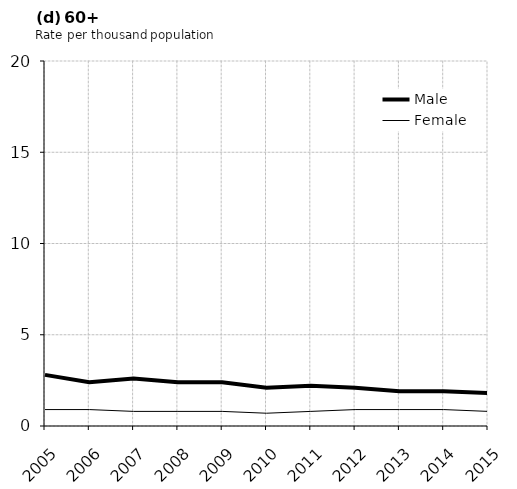
| Category | Male | Female |
|---|---|---|
| 2005.0 | 2.8 | 0.9 |
| 2006.0 | 2.4 | 0.9 |
| 2007.0 | 2.6 | 0.8 |
| 2008.0 | 2.4 | 0.8 |
| 2009.0 | 2.4 | 0.8 |
| 2010.0 | 2.1 | 0.7 |
| 2011.0 | 2.2 | 0.8 |
| 2012.0 | 2.1 | 0.9 |
| 2013.0 | 1.9 | 0.9 |
| 2014.0 | 1.9 | 0.9 |
| 2015.0 | 1.8 | 0.8 |